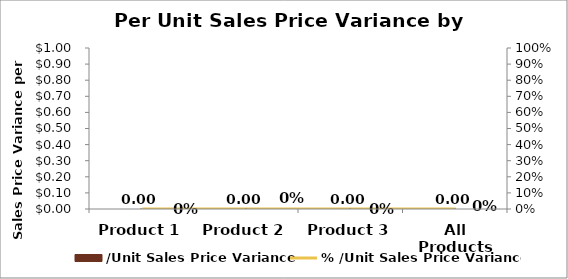
| Category | /Unit Sales Price Variance |
|---|---|
| Product 1 | 0 |
| Product 2 | 0 |
| Product 3 | 0 |
| All Products | 0 |